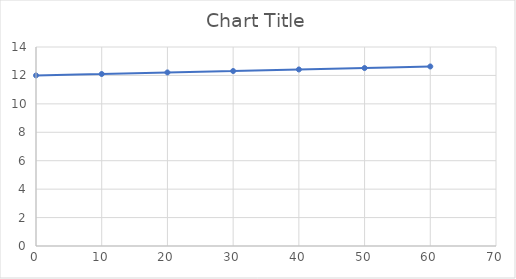
| Category | Series 0 |
|---|---|
| 0.0 | 12 |
| 10.0 | 12.1 |
| 20.0 | 12.21 |
| 30.0 | 12.31 |
| 40.0 | 12.42 |
| 50.0 | 12.52 |
| 60.0 | 12.63 |